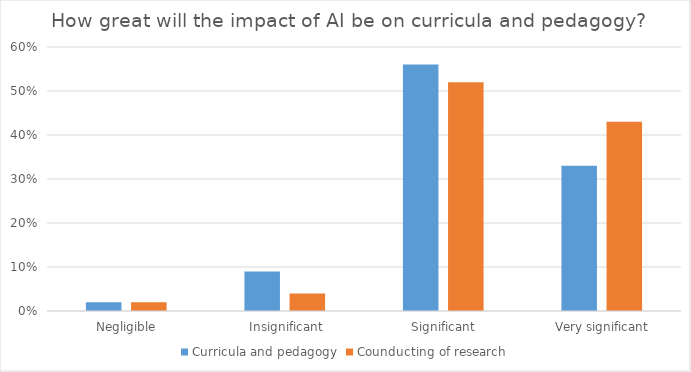
| Category | Curricula and pedagogy | Counducting of research |
|---|---|---|
|  Negligible | 0.02 | 0.02 |
|  Insignificant | 0.09 | 0.04 |
|  Significant | 0.56 | 0.52 |
|  Very significant | 0.33 | 0.43 |